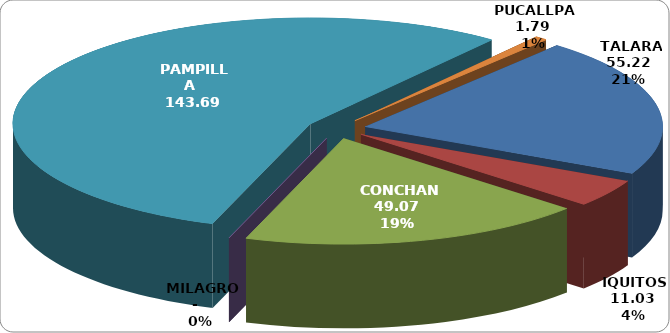
| Category | Series 0 |
|---|---|
| TALARA | 55.221 |
| IQUITOS | 11.033 |
| CONCHAN | 49.068 |
| MILAGRO | 0 |
| PAMPILLA | 143.692 |
| PUCALLPA | 1.794 |